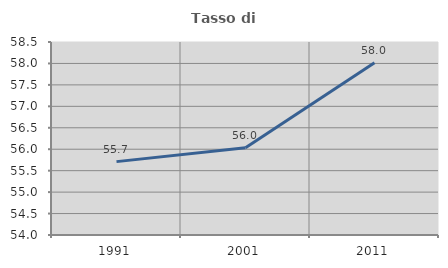
| Category | Tasso di occupazione   |
|---|---|
| 1991.0 | 55.711 |
| 2001.0 | 56.033 |
| 2011.0 | 58.018 |